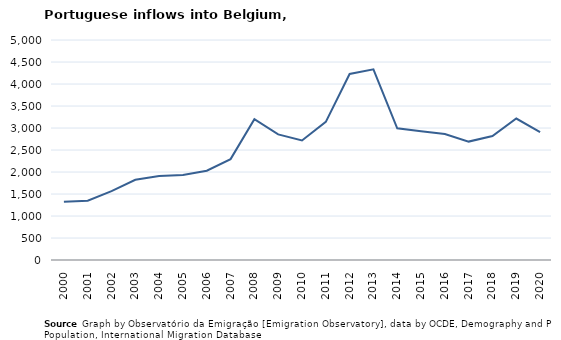
| Category | Entradas |
|---|---|
| 2000.0 | 1324 |
| 2001.0 | 1347 |
| 2002.0 | 1567 |
| 2003.0 | 1823 |
| 2004.0 | 1907 |
| 2005.0 | 1934 |
| 2006.0 | 2030 |
| 2007.0 | 2293 |
| 2008.0 | 3200 |
| 2009.0 | 2854 |
| 2010.0 | 2717 |
| 2011.0 | 3140 |
| 2012.0 | 4228 |
| 2013.0 | 4332 |
| 2014.0 | 2993 |
| 2015.0 | 2927 |
| 2016.0 | 2863 |
| 2017.0 | 2691 |
| 2018.0 | 2816 |
| 2019.0 | 3215 |
| 2020.0 | 2907 |